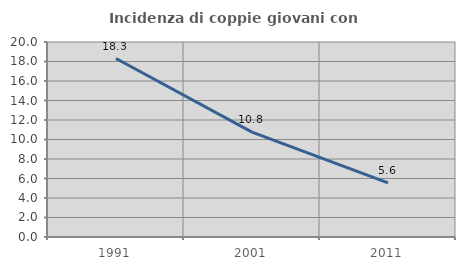
| Category | Incidenza di coppie giovani con figli |
|---|---|
| 1991.0 | 18.302 |
| 2001.0 | 10.752 |
| 2011.0 | 5.555 |